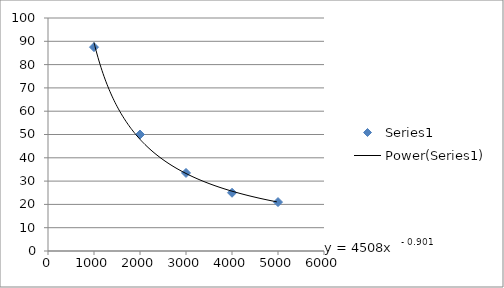
| Category | Series 0 |
|---|---|
| 1000.0 | 87.5 |
| 2000.0 | 50 |
| 3000.0 | 33.5 |
| 4000.0 | 25 |
| 5000.0 | 21 |